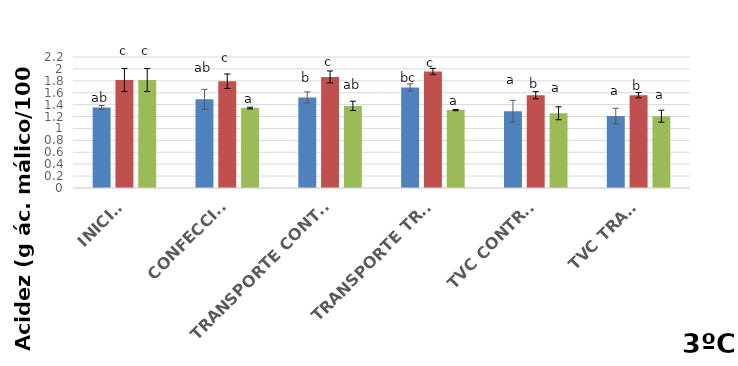
| Category | Black Splendor | Showtime | Black Gold |
|---|---|---|---|
| INICIAL | 1.353 | 1.813 | 1.813 |
| CONFECCIÓN | 1.49 | 1.793 | 1.342 |
|  TRANSPORTE CONTROL | 1.521 | 1.865 | 1.379 |
| TRANSPORTE TRAT. | 1.69 | 1.956 | 1.309 |
| TVC CONTROL | 1.291 | 1.559 | 1.255 |
| TVC TRAT. | 1.208 | 1.559 | 1.206 |